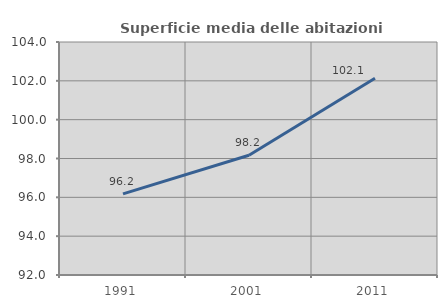
| Category | Superficie media delle abitazioni occupate |
|---|---|
| 1991.0 | 96.176 |
| 2001.0 | 98.166 |
| 2011.0 | 102.133 |